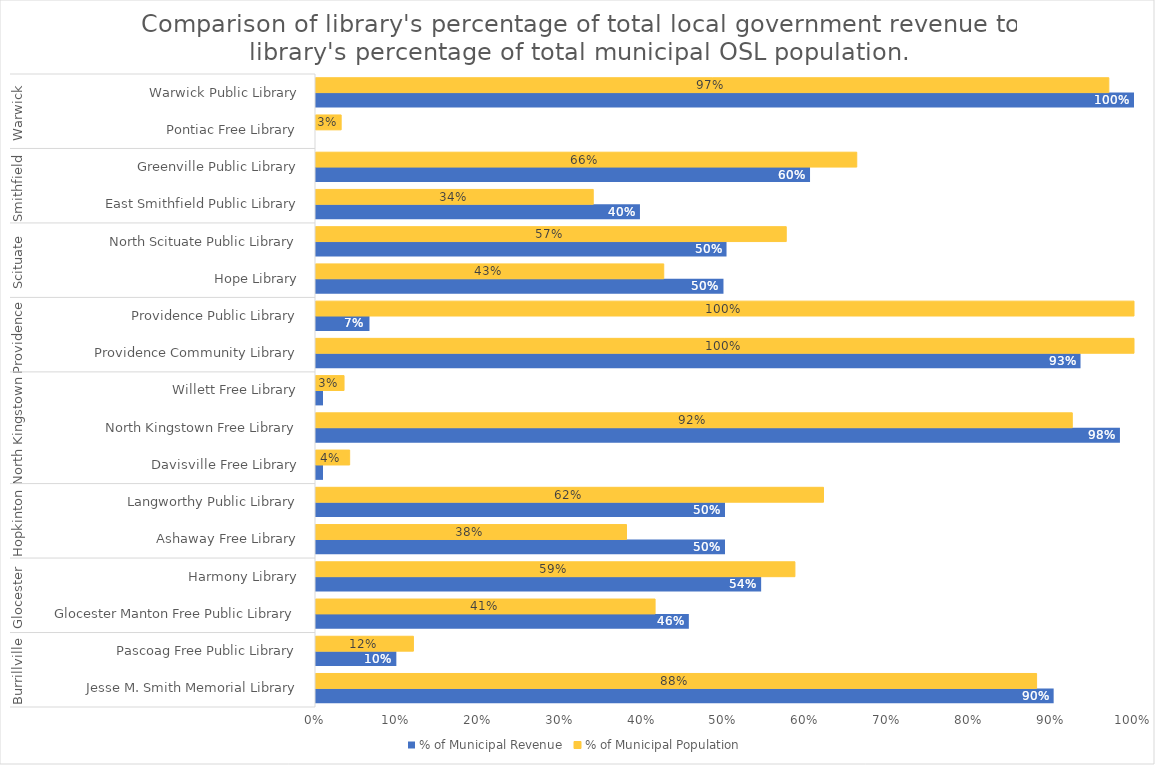
| Category | % of Municipal Revenue | % of Municipal Population |
|---|---|---|
| 0 | 0.902 | 0.881 |
| 1 | 0.098 | 0.119 |
| 2 | 0.456 | 0.415 |
| 3 | 0.544 | 0.585 |
| 4 | 0.5 | 0.38 |
| 5 | 0.5 | 0.62 |
| 6 | 0.009 | 0.041 |
| 7 | 0.983 | 0.925 |
| 8 | 0.009 | 0.034 |
| 9 | 0.935 | 1 |
| 10 | 0.065 | 1 |
| 11 | 0.498 | 0.425 |
| 12 | 0.502 | 0.575 |
| 13 | 0.396 | 0.339 |
| 14 | 0.604 | 0.661 |
| 15 | 0 | 0.031 |
| 16 | 1 | 0.969 |